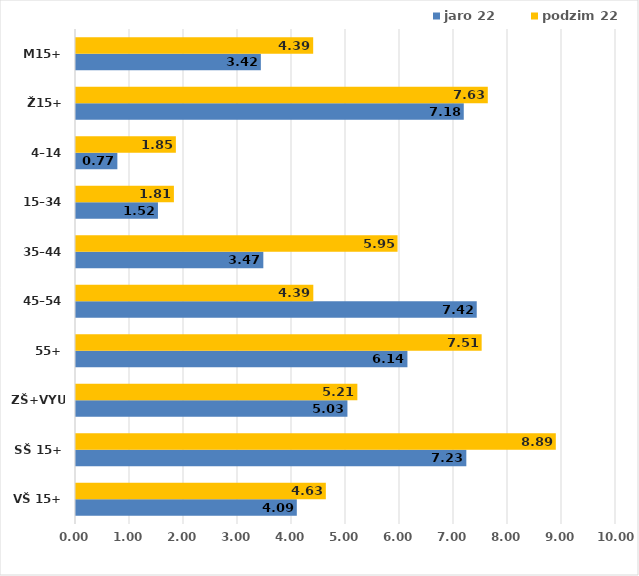
| Category | jaro 22 | podzim 22 |
|---|---|---|
| VŠ 15+ | 4.089 | 4.627 |
| SŠ 15+ | 7.228 | 8.886 |
| ZŠ+VYUČ | 5.026 | 5.21 |
| 55+ | 6.138 | 7.512 |
| 45–54 | 7.421 | 4.395 |
| 35–44 | 3.469 | 5.954 |
| 15–34 | 1.518 | 1.813 |
| 4–14 | 0.766 | 1.85 |
| Ž15+ | 7.181 | 7.626 |
| M15+ | 3.423 | 4.392 |